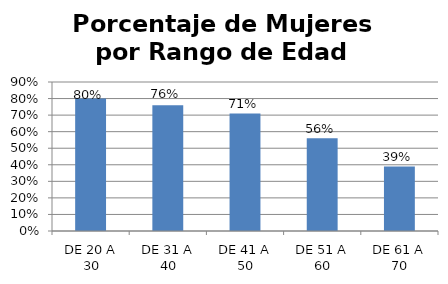
| Category | Porcentaje |
|---|---|
| DE 20 A 30 | 0.8 |
| DE 31 A 40 | 0.76 |
| DE 41 A 50 | 0.71 |
| DE 51 A 60 | 0.56 |
| DE 61 A 70 | 0.39 |